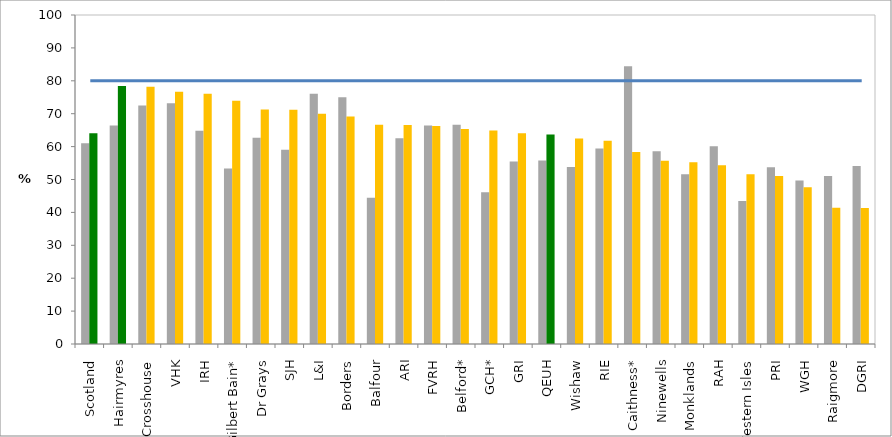
| Category | 2016 (%) | 2017 (%) |
|---|---|---|
| Scotland | 61.048 | 64.086 |
| Hairmyres | 66.39 | 78.414 |
| Crosshouse | 72.496 | 78.185 |
| VHK | 73.146 | 76.681 |
| IRH | 64.828 | 76.074 |
| Gilbert Bain* | 53.333 | 73.913 |
| Dr Grays | 62.727 | 71.287 |
| SJH | 59.024 | 71.163 |
| L&I | 76.087 | 70 |
| Borders | 75 | 69.167 |
| Balfour | 44.444 | 66.667 |
| ARI | 62.55 | 66.531 |
| FVRH | 66.418 | 66.259 |
| Belford* | 66.667 | 65.385 |
| GCH* | 46.154 | 64.865 |
| GRI | 55.462 | 64.066 |
| QEUH | 55.793 | 63.698 |
| Wishaw | 53.815 | 62.5 |
| RIE | 59.392 | 61.743 |
| Caithness* | 84.444 | 58.333 |
| Ninewells | 58.556 | 55.67 |
| Monklands | 51.57 | 55.274 |
| RAH | 60.142 | 54.348 |
| Western Isles | 43.478 | 51.613 |
| PRI | 53.714 | 51.049 |
| WGH | 49.733 | 47.644 |
| Raigmore | 51.037 | 41.434 |
| DGRI | 54.14 | 41.317 |